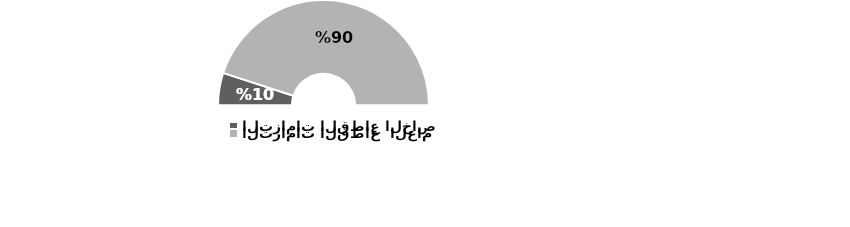
| Category | Series 0 |
|---|---|
| التزامات القطاع الخاص | 0.1 |
| التزامات القطاع  العام | 0.9 |
| المجموع | 1 |